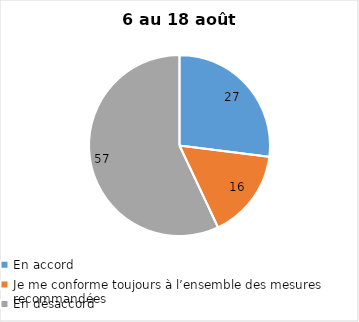
| Category | Series 0 |
|---|---|
| En accord | 27 |
| Je me conforme toujours à l’ensemble des mesures recommandées | 16 |
| En désaccord | 57 |